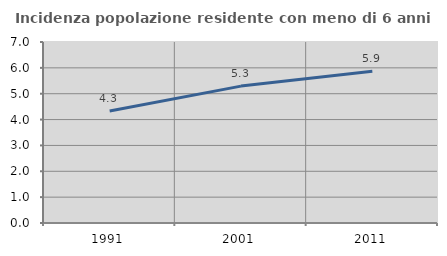
| Category | Incidenza popolazione residente con meno di 6 anni |
|---|---|
| 1991.0 | 4.331 |
| 2001.0 | 5.294 |
| 2011.0 | 5.872 |